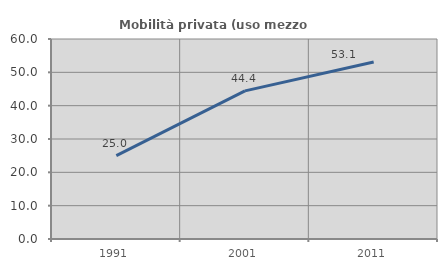
| Category | Mobilità privata (uso mezzo privato) |
|---|---|
| 1991.0 | 25 |
| 2001.0 | 44.444 |
| 2011.0 | 53.103 |